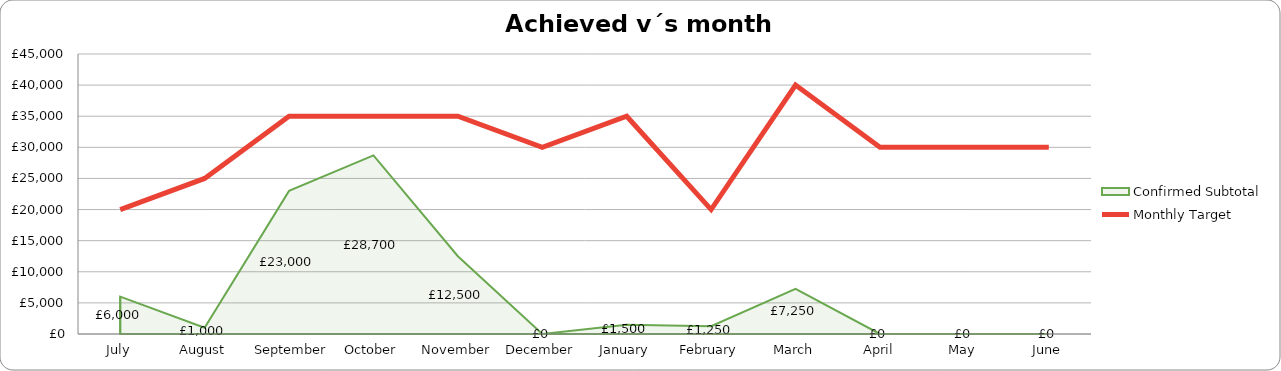
| Category | Monthly Target |
|---|---|
| 2019-07-01 | 20000 |
| 2019-08-01 | 25000 |
| 2019-09-01 | 35000 |
| 2019-10-01 | 35000 |
| 2019-11-01 | 35000 |
| 2019-12-01 | 30000 |
| 2020-01-01 | 35000 |
| 2020-02-01 | 20000 |
| 2020-03-01 | 40000 |
| 2020-04-01 | 30000 |
| 2020-05-01 | 30000 |
| 2020-06-01 | 30000 |